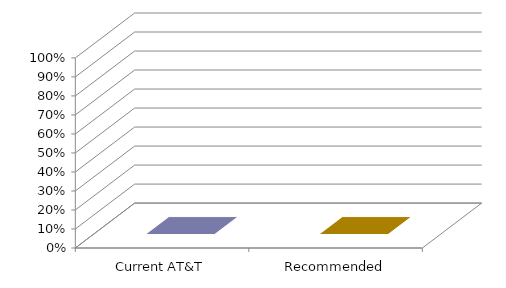
| Category | Series 0 |
|---|---|
| Current AT&T | 0 |
| Recommended | 0 |